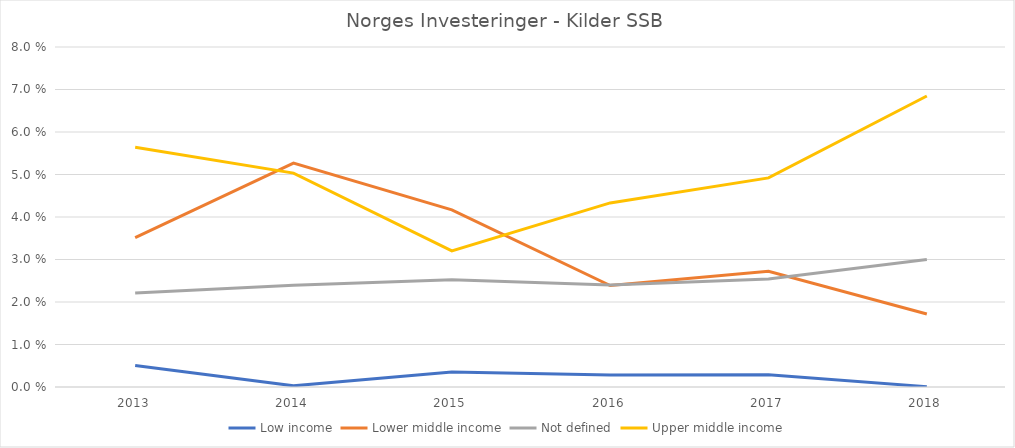
| Category | Low income | Lower middle income | Not defined | Upper middle income |
|---|---|---|---|---|
| 2013.0 | 0.005 | 0.035 | 0.022 | 0.056 |
| 2014.0 | 0 | 0.053 | 0.024 | 0.05 |
| 2015.0 | 0.004 | 0.042 | 0.025 | 0.032 |
| 2016.0 | 0.003 | 0.024 | 0.024 | 0.043 |
| 2017.0 | 0.003 | 0.027 | 0.025 | 0.049 |
| 2018.0 | 0 | 0.017 | 0.03 | 0.068 |